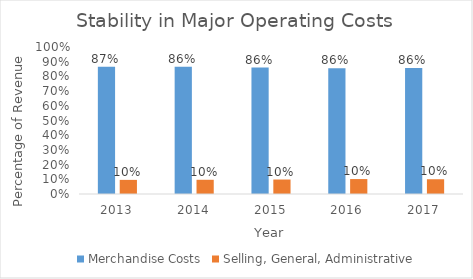
| Category | Merchandise Costs | Selling, General, Administrative |
|---|---|---|
| 2013.0 | 0.865 | 0.096 |
| 2014.0 | 0.865 | 0.097 |
| 2015.0 | 0.86 | 0.098 |
| 2016.0 | 0.856 | 0.102 |
| 2017.0 | 0.857 | 0.1 |